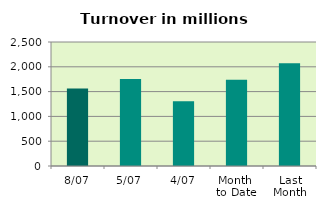
| Category | Series 0 |
|---|---|
| 8/07 | 1562.375 |
| 5/07 | 1754.222 |
| 4/07 | 1304.061 |
| Month 
to Date | 1739.725 |
| Last
Month | 2071.376 |